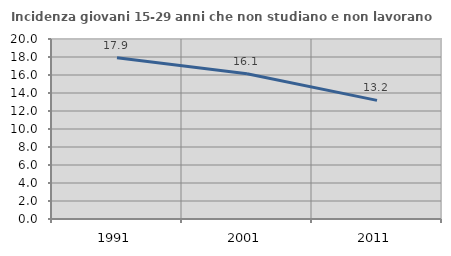
| Category | Incidenza giovani 15-29 anni che non studiano e non lavorano  |
|---|---|
| 1991.0 | 17.91 |
| 2001.0 | 16.129 |
| 2011.0 | 13.178 |